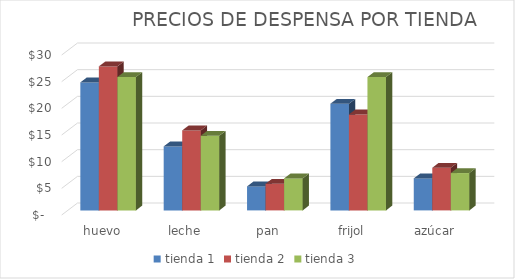
| Category | tienda 1 | tienda 2 | tienda 3 |
|---|---|---|---|
| huevo | 24 | 27 | 25 |
| leche | 12 | 15 | 14 |
| pan | 4.5 | 5 | 6 |
| frijol | 20 | 18 | 25 |
| azúcar | 6 | 8 | 7 |